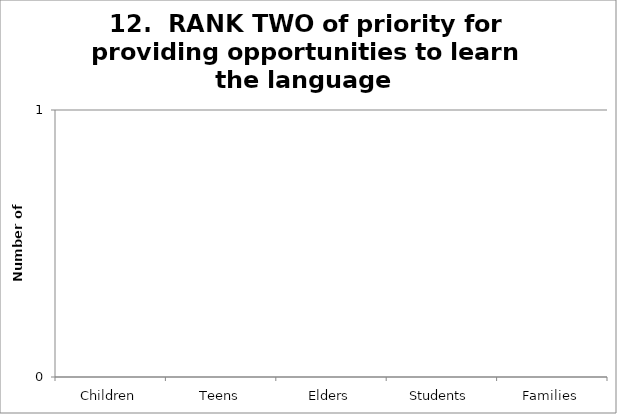
| Category | 12.  RANK TWO of priority for providing opportunities to learn the language  |
|---|---|
| Children | 0 |
| Teens | 0 |
| Elders | 0 |
| Students | 0 |
| Families | 0 |